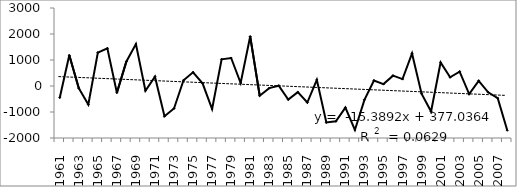
| Category | veri |
|---|---|
| 1961.0 | -450.622 |
| 1962.0 | 1184.98 |
| 1963.0 | -85.792 |
| 1964.0 | -712.547 |
| 1965.0 | 1284.366 |
| 1966.0 | 1447.881 |
| 1967.0 | -261.393 |
| 1968.0 | 946.025 |
| 1969.0 | 1613.792 |
| 1970.0 | -182.243 |
| 1971.0 | 357.474 |
| 1972.0 | -1161.3 |
| 1973.0 | -863.279 |
| 1974.0 | 222.243 |
| 1975.0 | 527.711 |
| 1976.0 | 101.264 |
| 1977.0 | -885.735 |
| 1978.0 | 1027.664 |
| 1979.0 | 1077.788 |
| 1980.0 | 114.79 |
| 1981.0 | 1905.645 |
| 1982.0 | -371.644 |
| 1983.0 | -80.754 |
| 1984.0 | 11.215 |
| 1985.0 | -520.276 |
| 1986.0 | -235.847 |
| 1987.0 | -636.008 |
| 1988.0 | 236.089 |
| 1989.0 | -1404.029 |
| 1990.0 | -1355.393 |
| 1991.0 | -829.786 |
| 1992.0 | -1691.713 |
| 1993.0 | -532.074 |
| 1994.0 | 212.637 |
| 1995.0 | 73.68 |
| 1996.0 | 397.851 |
| 1997.0 | 266.067 |
| 1998.0 | 1253.759 |
| 1999.0 | -297.508 |
| 2000.0 | -979.143 |
| 2001.0 | 904.325 |
| 2002.0 | 337.061 |
| 2003.0 | 553.587 |
| 2004.0 | -309.929 |
| 2005.0 | 199.539 |
| 2006.0 | -241.222 |
| 2007.0 | -466.792 |
| 2008.0 | -1702.408 |